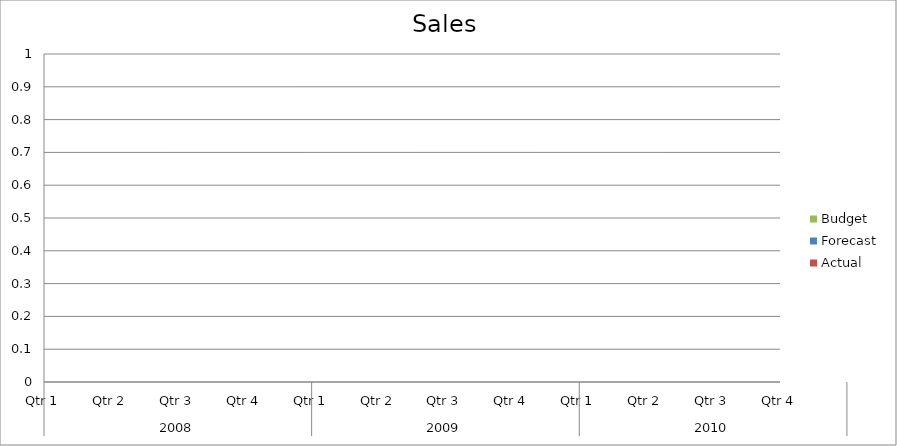
| Category | Budget | Forecast | Actual |
|---|---|---|---|
| 0 | 2970 | 1210 | 680 |
| 1 | 1930 | 1560 | 680 |
| 2 | 2050 | 930 | 740 |
| 3 | 2180 | 740 | 2810 |
| 4 | 2240 | 1280 | 1030 |
| 5 | 650 | 3430 | 930 |
| 6 | 3500 | 870 | 1930 |
| 7 | 1970 | 3450 | 2880 |
| 8 | 2300 | 3370 | 1780 |
| 9 | 3350 | 1630 | 3410 |
| 10 | 1760 | 3100 | 2200 |
| 11 | 970 | 1840 | 1260 |